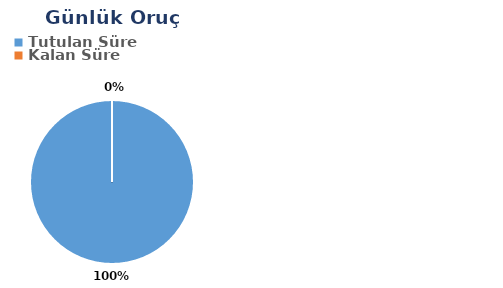
| Category | Günlük |
|---|---|
| Tutulan Süre | 0.583 |
| Kalan Süre | 0 |